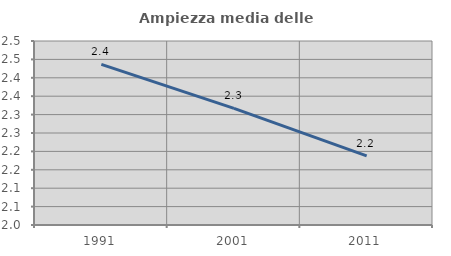
| Category | Ampiezza media delle famiglie |
|---|---|
| 1991.0 | 2.437 |
| 2001.0 | 2.317 |
| 2011.0 | 2.188 |